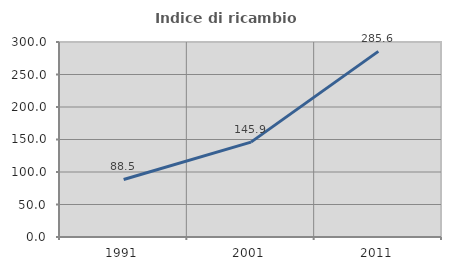
| Category | Indice di ricambio occupazionale  |
|---|---|
| 1991.0 | 88.506 |
| 2001.0 | 145.926 |
| 2011.0 | 285.567 |